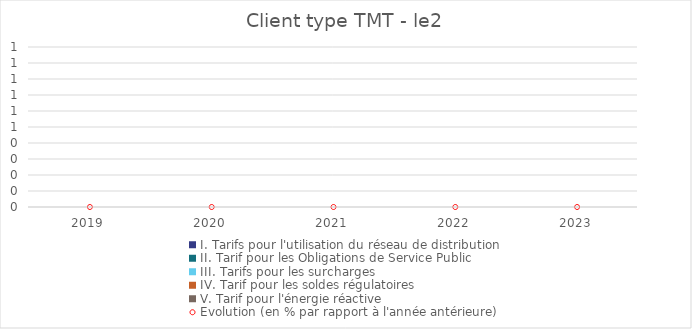
| Category | I. Tarifs pour l'utilisation du réseau de distribution | II. Tarif pour les Obligations de Service Public  | III. Tarifs pour les surcharges   | IV. Tarif pour les soldes régulatoires | V. Tarif pour l'énergie réactive |
|---|---|---|---|---|---|
| 2019.0 | 0 | 0 | 0 | 0 | 0 |
| 2020.0 | 0 | 0 | 0 | 0 | 0 |
| 2021.0 | 0 | 0 | 0 | 0 | 0 |
| 2022.0 | 0 | 0 | 0 | 0 | 0 |
| 2023.0 | 0 | 0 | 0 | 0 | 0 |